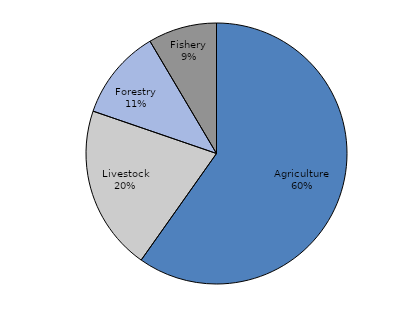
| Category | Higher education |
|---|---|
| Crop  | 59.791 |
| Livestock | 20.468 |
| Forestry | 11.227 |
| Fisheries | 8.513 |